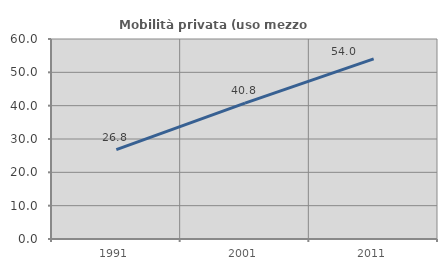
| Category | Mobilità privata (uso mezzo privato) |
|---|---|
| 1991.0 | 26.826 |
| 2001.0 | 40.775 |
| 2011.0 | 54.031 |